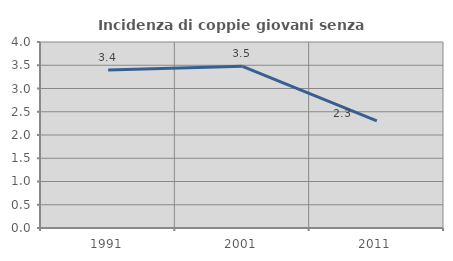
| Category | Incidenza di coppie giovani senza figli |
|---|---|
| 1991.0 | 3.397 |
| 2001.0 | 3.476 |
| 2011.0 | 2.303 |